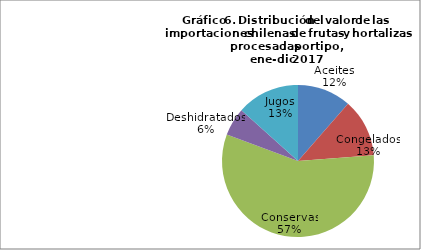
| Category | Series 0 |
|---|---|
| Aceites | 43959123.69 |
| Congelados | 47546132.32 |
| Conservas | 218788375.02 |
| Deshidratados | 22885078.68 |
| Jugos | 51369183.21 |